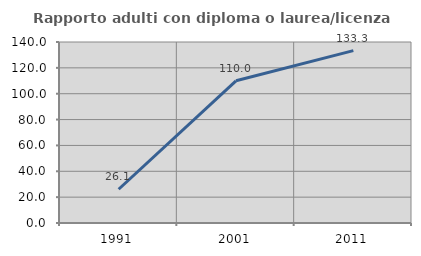
| Category | Rapporto adulti con diploma o laurea/licenza media  |
|---|---|
| 1991.0 | 26.087 |
| 2001.0 | 110 |
| 2011.0 | 133.333 |